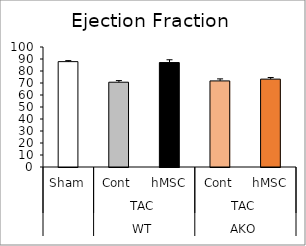
| Category | Series 0 |
|---|---|
| 0 | 87.8 |
| 1 | 70.662 |
| 2 | 87.042 |
| 3 | 71.743 |
| 4 | 73.228 |